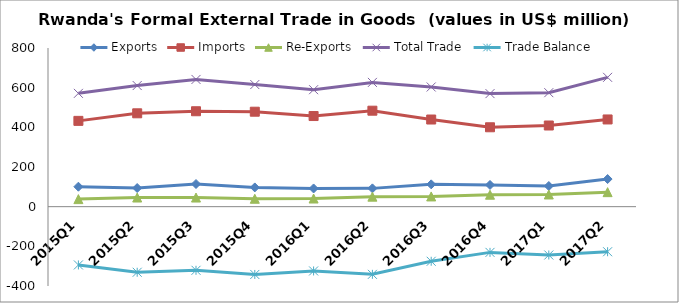
| Category | Exports | Imports | Re-Exports | Total Trade | Trade Balance |
|---|---|---|---|---|---|
| 2015Q1 | 100.645 | 432.606 | 38.092 | 571.343 | -293.87 |
| 2015Q2 | 93.892 | 470.703 | 46.126 | 610.721 | -330.685 |
| 2015Q3 | 114.24 | 481.145 | 46.053 | 641.438 | -320.853 |
| 2015Q4 | 97.026 | 478.754 | 39.897 | 615.677 | -341.831 |
| 2016Q1 | 91.795 | 456.929 | 41.031 | 589.755 | -324.103 |
| 2016Q2 | 92.237 | 483.863 | 50.433 | 626.533 | -341.192 |
| 2016Q3 | 112.536 | 439.389 | 51.515 | 603.44 | -275.338 |
| 2016Q4 | 109.503 | 400.306 | 60.303 | 570.112 | -230.5 |
| 2017Q1 | 104.064 | 409.239 | 61.473 | 574.776 | -243.702 |
| 2017Q2 | 139.242 | 439.68 | 73.169 | 652.091 | -227.269 |